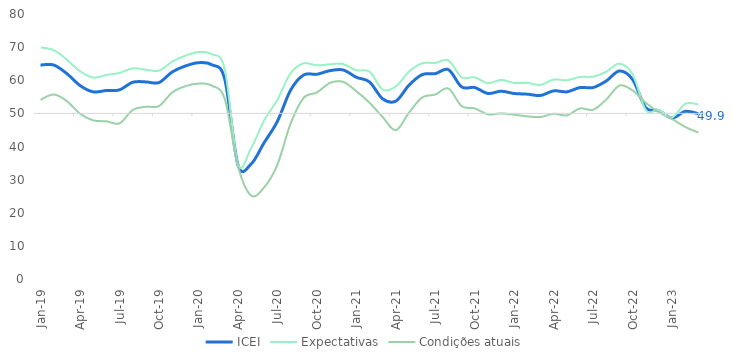
| Category | ICEI | Expectativas | Condições atuais |
|---|---|---|---|
| 2019-01-01 | 64.6 | 69.9 | 54.1 |
| 2019-02-01 | 64.6 | 69.1 | 55.7 |
| 2019-03-01 | 62 | 66.2 | 53.7 |
| 2019-04-01 | 58.4 | 62.7 | 49.9 |
| 2019-05-01 | 56.5 | 60.8 | 47.9 |
| 2019-06-01 | 56.9 | 61.6 | 47.6 |
| 2019-07-01 | 57.1 | 62.2 | 47 |
| 2019-08-01 | 59.4 | 63.6 | 51 |
| 2019-09-01 | 59.5 | 63.2 | 52 |
| 2019-10-01 | 59.3 | 62.9 | 52.2 |
| 2019-11-01 | 62.5 | 65.6 | 56.3 |
| 2019-12-01 | 64.3 | 67.4 | 58.2 |
| 2020-01-01 | 65.3 | 68.5 | 59 |
| 2020-02-01 | 64.7 | 67.9 | 58.4 |
| 2020-03-01 | 60.3 | 63.3 | 54.3 |
| 2020-04-01 | 34.5 | 34.7 | 34.1 |
| 2020-05-01 | 34.7 | 39.5 | 25.2 |
| 2020-06-01 | 41.2 | 47.9 | 27.7 |
| 2020-07-01 | 47.6 | 54.1 | 34.5 |
| 2020-08-01 | 57 | 62.1 | 46.9 |
| 2020-09-01 | 61.6 | 65.1 | 54.7 |
| 2020-10-01 | 61.8 | 64.5 | 56.3 |
| 2020-11-01 | 62.9 | 64.8 | 59.2 |
| 2020-12-01 | 63.1 | 64.9 | 59.5 |
| 2021-01-01 | 60.9 | 63 | 56.7 |
| 2021-02-01 | 59.5 | 62.6 | 53.2 |
| 2021-03-01 | 54.4 | 57.2 | 48.9 |
| 2021-04-01 | 53.7 | 58.1 | 44.9 |
| 2021-05-01 | 58.5 | 62.6 | 50.2 |
| 2021-06-01 | 61.7 | 65.1 | 54.8 |
| 2021-07-01 | 62 | 65.2 | 55.7 |
| 2021-08-01 | 63.2 | 66 | 57.5 |
| 2021-09-01 | 58 | 60.9 | 52.2 |
| 2021-10-01 | 57.8 | 60.9 | 51.5 |
| 2021-11-01 | 56 | 59.1 | 49.7 |
| 2021-12-01 | 56.7 | 60.1 | 50 |
| 2022-01-01 | 56 | 59.2 | 49.6 |
| 2022-02-01 | 55.8 | 59.2 | 49.1 |
| 2022-03-01 | 55.4 | 58.6 | 48.9 |
| 2022-04-01 | 56.8 | 60.2 | 49.9 |
| 2022-05-01 | 56.5 | 60 | 49.4 |
| 2022-06-01 | 57.8 | 61 | 51.5 |
| 2022-07-01 | 57.8 | 61.1 | 51.1 |
| 2022-08-01 | 59.8 | 62.6 | 54.2 |
| 2022-09-01 | 62.8 | 65 | 58.4 |
| 2022-10-01 | 60.2 | 61.8 | 56.9 |
| 2022-11-01 | 51.7 | 51 | 53.2 |
| 2022-12-01 | 50.8 | 51 | 50.3 |
| 2023-01-01 | 48.6 | 48.8 | 48.3 |
| 2023-02-01 | 50.6 | 52.9 | 45.9 |
| 2023-03-01 | 49.9 | 52.7 | 44.2 |